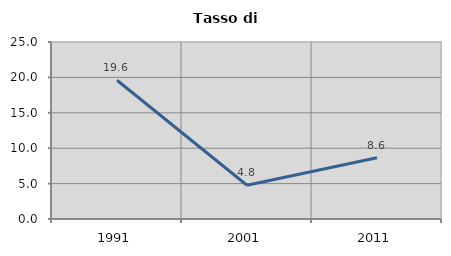
| Category | Tasso di disoccupazione   |
|---|---|
| 1991.0 | 19.595 |
| 2001.0 | 4.762 |
| 2011.0 | 8.649 |